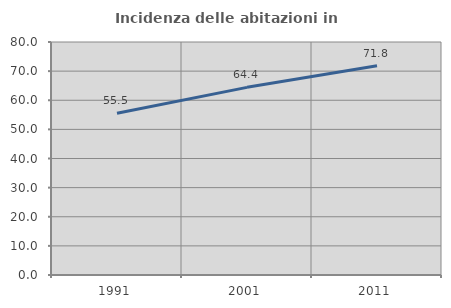
| Category | Incidenza delle abitazioni in proprietà  |
|---|---|
| 1991.0 | 55.506 |
| 2001.0 | 64.43 |
| 2011.0 | 71.816 |